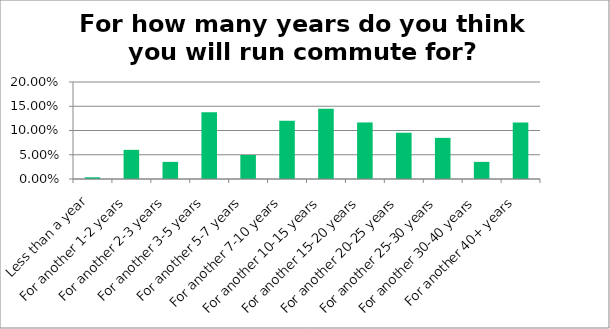
| Category | Responses |
|---|---|
| Less than a year | 0.004 |
| For another 1-2 years | 0.06 |
| For another 2-3 years | 0.035 |
| For another 3-5 years | 0.138 |
| For another 5-7 years | 0.05 |
| For another 7-10 years | 0.12 |
| For another 10-15 years | 0.145 |
| For another 15-20 years | 0.117 |
| For another 20-25 years | 0.095 |
| For another 25-30 years | 0.085 |
| For another 30-40 years | 0.035 |
| For another 40+ years | 0.117 |